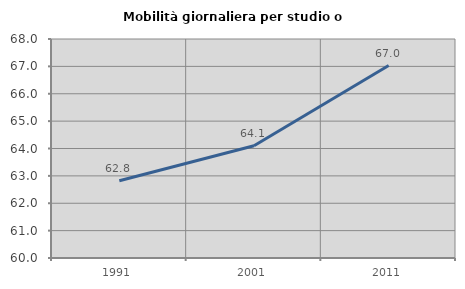
| Category | Mobilità giornaliera per studio o lavoro |
|---|---|
| 1991.0 | 62.821 |
| 2001.0 | 64.098 |
| 2011.0 | 67.03 |